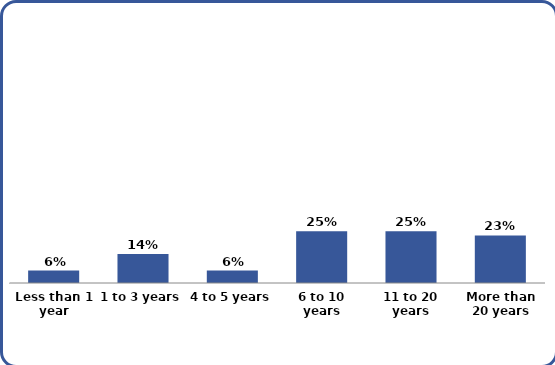
| Category | Series 0 |
|---|---|
| Less than 1 year | 0.06 |
| 1 to 3 years | 0.14 |
| 4 to 5 years | 0.06 |
| 6 to 10 years | 0.25 |
| 11 to 20 years | 0.25 |
| More than 20 years | 0.23 |